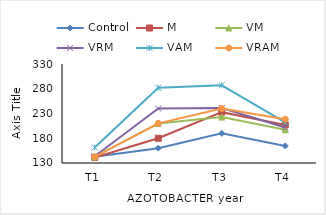
| Category | Control | M | VM | VRM | VAM | VRAM |
|---|---|---|---|---|---|---|
| T1 | 142.5 | 141.2 | 142.3 | 143.5 | 161.3 | 142.5 |
| T2 | 160 | 180 | 210 | 240 | 282 | 210 |
| T3 | 190 | 232.7 | 222.8 | 241 | 287 | 240 |
| T4 | 164.5 | 206.8 | 197.1 | 201.6 | 212 | 218.4 |